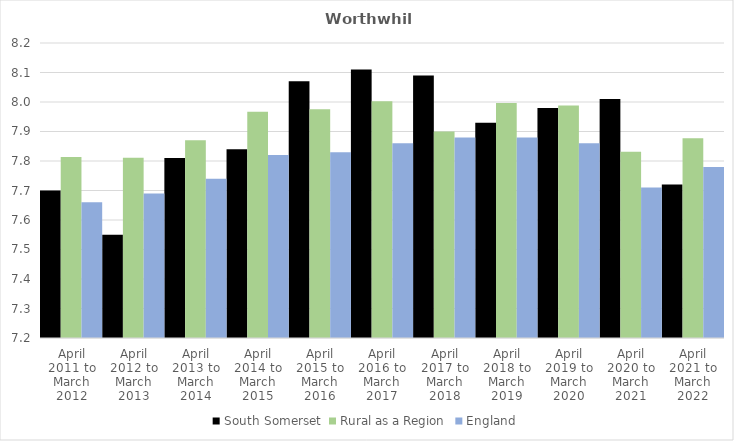
| Category | South Somerset | Rural as a Region | England |
|---|---|---|---|
| April 2011 to March 2012 | 7.7 | 7.813 | 7.66 |
| April 2012 to March 2013 | 7.55 | 7.811 | 7.69 |
| April 2013 to March 2014 | 7.81 | 7.871 | 7.74 |
| April 2014 to March 2015 | 7.84 | 7.967 | 7.82 |
| April 2015 to March 2016 | 8.07 | 7.975 | 7.83 |
| April 2016 to March 2017 | 8.11 | 8.002 | 7.86 |
| April 2017 to March 2018 | 8.09 | 7.9 | 7.88 |
| April 2018 to March 2019 | 7.93 | 7.996 | 7.88 |
| April 2019 to March 2020 | 7.98 | 7.988 | 7.86 |
| April 2020 to March 2021 | 8.01 | 7.831 | 7.71 |
| April 2021 to March 2022 | 7.72 | 7.877 | 7.78 |